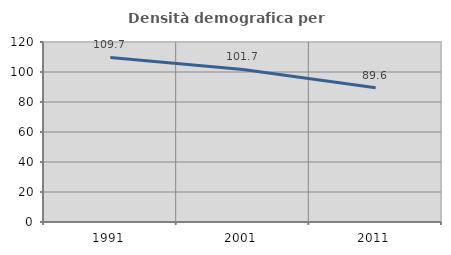
| Category | Densità demografica |
|---|---|
| 1991.0 | 109.721 |
| 2001.0 | 101.709 |
| 2011.0 | 89.571 |